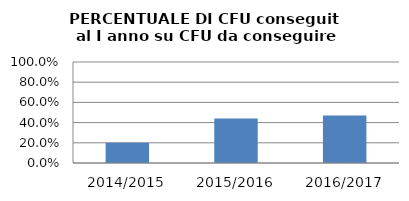
| Category | 2014/2015 2015/2016 2016/2017 |
|---|---|
| 2014/2015 | 0.201 |
| 2015/2016 | 0.442 |
| 2016/2017 | 0.47 |